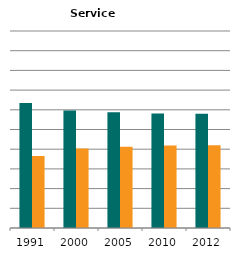
| Category | Male | Female |
|---|---|---|
| 1991.0 | 0.635 | 0.365 |
| 2000.0 | 0.597 | 0.403 |
| 2005.0 | 0.587 | 0.413 |
| 2010.0 | 0.581 | 0.419 |
| 2012.0 | 0.58 | 0.42 |